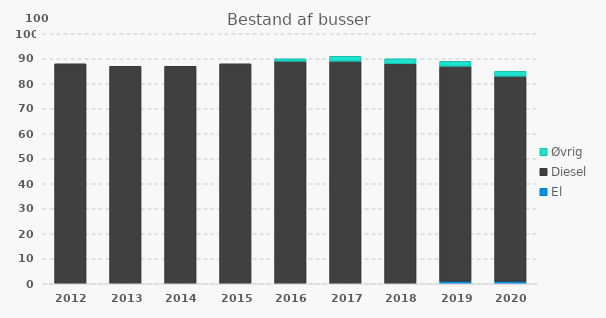
| Category | El | Diesel | Øvrig |
|---|---|---|---|
| 2012 | 0 | 88 | 0 |
| 2013 | 0 | 87 | 0 |
| 2014 | 0 | 87 | 0 |
| 2015 | 0 | 88 | 0 |
| 2016 | 0 | 89 | 1 |
| 2017 | 0 | 89 | 2 |
| 2018 | 0 | 88 | 2 |
| 2019 | 1 | 86 | 2 |
| 2020 | 1 | 82 | 2 |